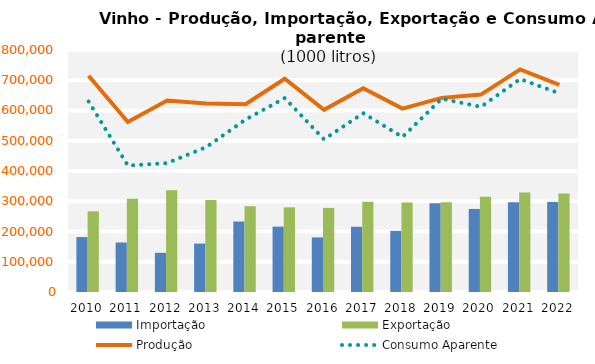
| Category | Importação | Exportação |
|---|---|---|
| 2010.0 | 181626.292 | 266645.39 |
| 2011.0 | 163608.843 | 307861.044 |
| 2012.0 | 129614.457 | 336267.888 |
| 2013.0 | 159952.994 | 304061.51 |
| 2014.0 | 233019.842 | 283616.833 |
| 2015.0 | 216109.144 | 279818.863 |
| 2016.0 | 180445.03 | 277950.485 |
| 2017.0 | 215582.089 | 298156.947 |
| 2018.0 | 202102.999 | 295819.82 |
| 2019.0 | 293526.114 | 296320.978 |
| 2020.0 | 274523.832 | 315138.399 |
| 2021.0 | 297095.15 | 328802.572 |
| 2022.0 | 297142.254 | 325357.404 |